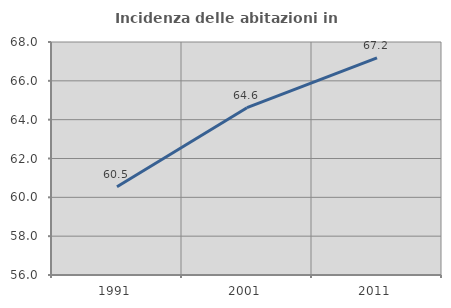
| Category | Incidenza delle abitazioni in proprietà  |
|---|---|
| 1991.0 | 60.55 |
| 2001.0 | 64.618 |
| 2011.0 | 67.185 |